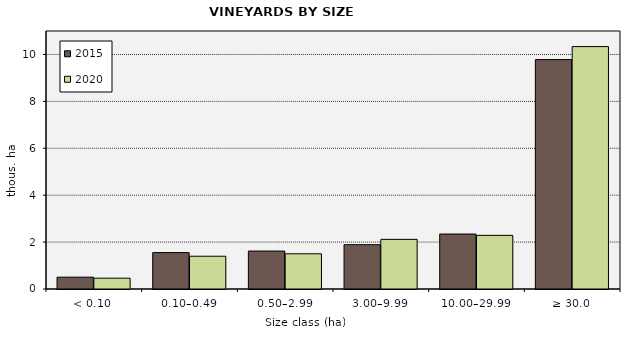
| Category | 2015 | 2020 |
|---|---|---|
| < 0.10 | 504.782 | 461.553 |
| 0.10–0.49 | 1552.186 | 1397.425 |
| 0.50–2.99 | 1617.335 | 1501.095 |
| 3.00–9.99 | 1889.059 | 2116.247 |
| 10.00–29.99 | 2343.44 | 2287.317 |
| ≥ 30.0 | 9781.788 | 10335.727 |